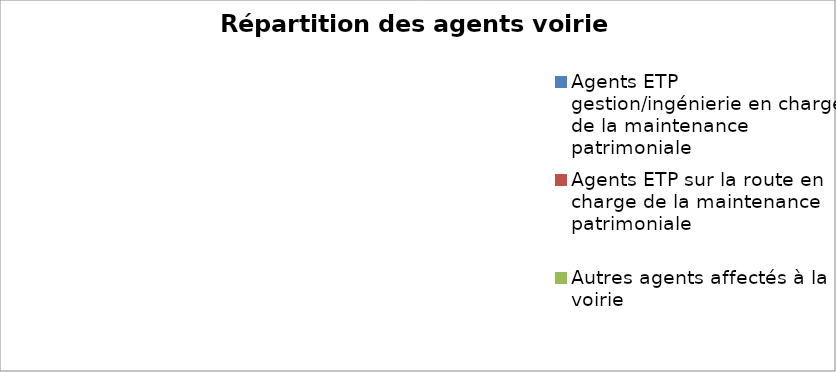
| Category | Series 0 |
|---|---|
| Agents ETP gestion/ingénierie en charge de la maintenance patrimoniale | 0 |
| Agents ETP sur la route en charge de la maintenance patrimoniale | 0 |
| Autres agents affectés à la voirie | 0 |